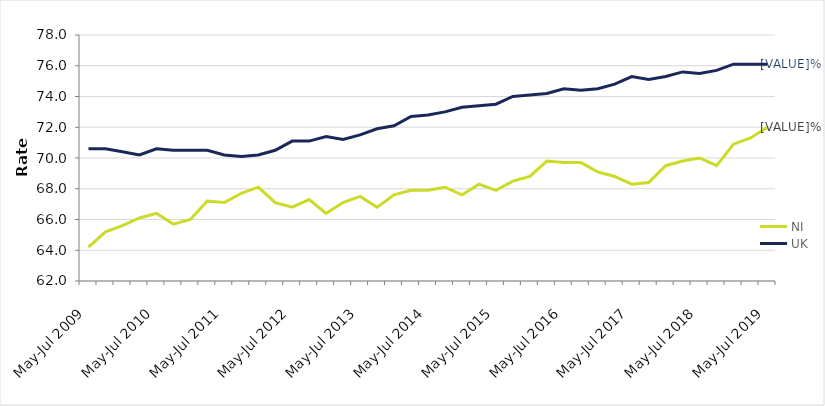
| Category | NI | UK |
|---|---|---|
| May-Jul 2009 | 64.2 | 70.6 |
| Aug-Oct 2009 | 65.2 | 70.6 |
| Nov-Jan 2010 | 65.6 | 70.4 |
| Feb-Apr 2010 | 66.1 | 70.2 |
| May-Jul 2010 | 66.4 | 70.6 |
| Aug-Oct 2010 | 65.7 | 70.5 |
| Nov-Jan 2011 | 66 | 70.5 |
| Feb-Apr 2011 | 67.2 | 70.5 |
| May-Jul 2011 | 67.1 | 70.2 |
| Aug-Oct 2011 | 67.7 | 70.1 |
| Nov-Jan 2012 | 68.1 | 70.2 |
| Feb-Apr 2012 | 67.1 | 70.5 |
| May-Jul 2012 | 66.8 | 71.1 |
| Aug-Oct 2012 | 67.3 | 71.1 |
| Nov-Jan 2013 | 66.4 | 71.4 |
| Feb-Apr 2013 | 67.1 | 71.2 |
| May-Jul 2013 | 67.5 | 71.5 |
| Aug-Oct 2013 | 66.8 | 71.9 |
| Nov-Jan 2014 | 67.6 | 72.1 |
| Feb-Apr 2014 | 67.9 | 72.7 |
| May-Jul 2014 | 67.9 | 72.8 |
| Aug-Oct 2014 | 68.1 | 73 |
| Nov-Jan 2015 | 67.6 | 73.3 |
| Feb-Apr 2015 | 68.3 | 73.4 |
| May-Jul 2015 | 67.9 | 73.5 |
| Aug-Oct 2015 | 68.5 | 74 |
| Nov-Jan 2016 | 68.8 | 74.1 |
| Feb-Apr 2016 | 69.8 | 74.2 |
| May-Jul 2016 | 69.7 | 74.5 |
| Aug-Oct 2016 | 69.7 | 74.4 |
| Nov-Jan 2017 | 69.1 | 74.5 |
| Feb-Apr 2017 | 68.8 | 74.8 |
| May-Jul 2017 | 68.3 | 75.3 |
| Aug-Oct 2017 | 68.4 | 75.1 |
| Nov-Jan 2018 | 69.5 | 75.3 |
| Feb-Apr 2018 | 69.8 | 75.6 |
| May-Jul 2018 | 70 | 75.5 |
| Aug-Oct 2018 | 69.5 | 75.7 |
| Nov-Jan 2019 | 70.9 | 76.1 |
| Feb-Apr 2019 | 71.3 | 76.1 |
| May-Jul 2019 | 72 | 76.1 |